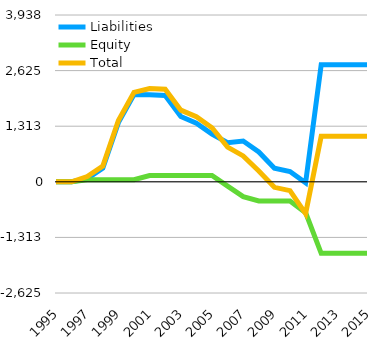
| Category | Liabilities  | Equity  | Total  |
|---|---|---|---|
| 1995 | -0.044 | 0 | -0.044 |
| 1996 | -0.044 | 0 | -0.044 |
| 1997 | 74.956 | 49.103 | 124.059 |
| 1998 | 322.835 | 49.103 | 371.938 |
| 1999 | 1397.588 | 49.103 | 1446.691 |
| 2000 | 2062.16 | 49.103 | 2111.263 |
| 2001 | 2052.585 | 148.934 | 2201.519 |
| 2002 | 2037.79 | 148.934 | 2186.724 |
| 2003 | 1542.482 | 148.934 | 1691.416 |
| 2004 | 1385.482 | 148.934 | 1534.416 |
| 2005 | 1126.482 | 148.934 | 1275.416 |
| 2006 | 921.482 | -103.066 | 818.416 |
| 2007 | 962.482 | -351.066 | 611.416 |
| 2008 | 705.482 | -451.066 | 254.416 |
| 2009 | 320.482 | -451.066 | -130.584 |
| 2010 | 242.482 | -451.066 | -208.584 |
| 2011 | -24.518 | -728.066 | -752.584 |
| 2012 | 2765.482 | -1688.066 | 1077.416 |
| 2013 | 2765.482 | -1688.066 | 1077.416 |
| 2014 | 2765.482 | -1688.066 | 1077.416 |
| 2015 | 2765.482 | -1688.066 | 1077.416 |